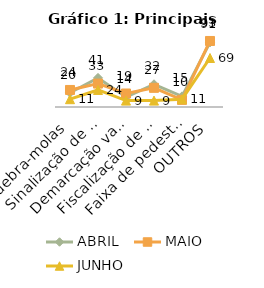
| Category | ABRIL | MAIO | JUNHO |
|---|---|---|---|
| Quebra-molas | 20 | 24 | 11 |
| Sinalização de vias públicas | 41 | 33 | 24 |
| Demarcação vagas estacionamento | 14 | 19 | 9 |
| Fiscalização de trânsito em vias e ruas | 32 | 27 | 9 |
| Faixa de pedestre | 15 | 10 | 11 |
| OUTROS | 91 | 93 | 69 |